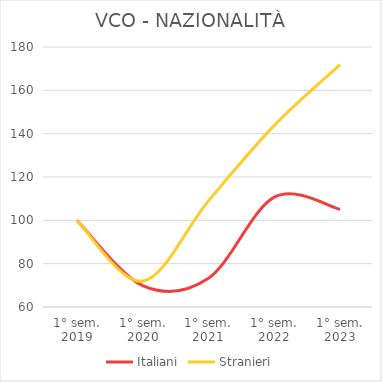
| Category | Italiani | Stranieri |
|---|---|---|
| 1° sem.
2019 | 100 | 100 |
| 1° sem.
2020 | 69.882 | 71.91 |
| 1° sem.
2021 | 73.228 | 108.989 |
| 1° sem.
2022 | 110.728 | 143.82 |
| 1° sem.
2023 | 105.118 | 171.91 |